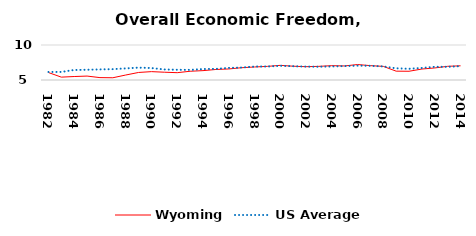
| Category | Wyoming  | US Average |
|---|---|---|
| 1982.0 | 6.065 | 6.149 |
| 1983.0 | 5.409 | 6.152 |
| 1984.0 | 5.496 | 6.429 |
| 1985.0 | 5.561 | 6.464 |
| 1986.0 | 5.34 | 6.512 |
| 1987.0 | 5.32 | 6.552 |
| 1988.0 | 5.712 | 6.659 |
| 1989.0 | 6.077 | 6.767 |
| 1990.0 | 6.196 | 6.71 |
| 1991.0 | 6.113 | 6.502 |
| 1992.0 | 6.045 | 6.463 |
| 1993.0 | 6.25 | 6.446 |
| 1994.0 | 6.337 | 6.563 |
| 1995.0 | 6.504 | 6.593 |
| 1996.0 | 6.576 | 6.73 |
| 1997.0 | 6.756 | 6.781 |
| 1998.0 | 6.86 | 6.926 |
| 1999.0 | 6.945 | 6.925 |
| 2000.0 | 7.092 | 7.031 |
| 2001.0 | 6.97 | 6.969 |
| 2002.0 | 6.9 | 6.912 |
| 2003.0 | 6.951 | 6.892 |
| 2004.0 | 7.047 | 6.934 |
| 2005.0 | 7.007 | 6.99 |
| 2006.0 | 7.21 | 7.048 |
| 2007.0 | 7.049 | 7.028 |
| 2008.0 | 6.948 | 6.935 |
| 2009.0 | 6.263 | 6.668 |
| 2010.0 | 6.249 | 6.605 |
| 2011.0 | 6.568 | 6.72 |
| 2012.0 | 6.722 | 6.883 |
| 2013.0 | 6.956 | 6.881 |
| 2014.0 | 7.028 | 6.973 |